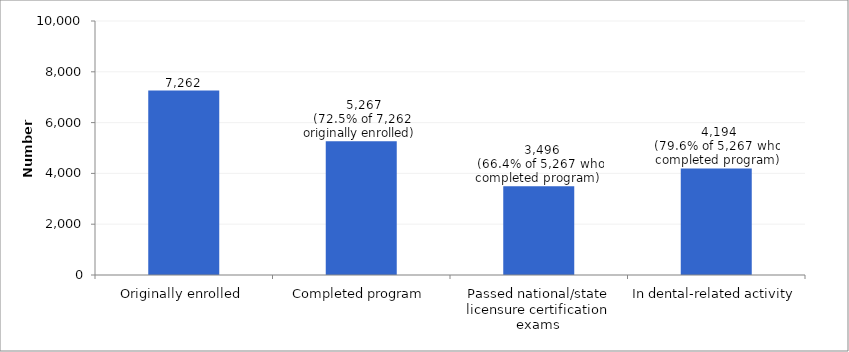
| Category | Series 0 |
|---|---|
| Originally enrolled | 7262 |
| Completed program | 5267 |
| Passed national/state licensure certification exams | 3496 |
| In dental-related activity | 4194 |